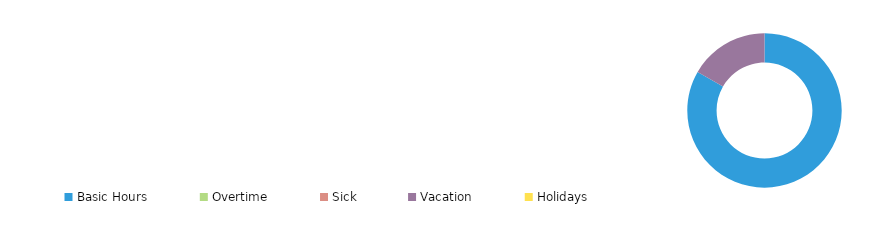
| Category | Series 2 | Series 3 |
|---|---|---|
| Basic Hours | 0.833 |  |
| Overtime | 0 |  |
| Sick | 0 |  |
| Vacation | 0.167 |  |
| Holidays | 0 |  |